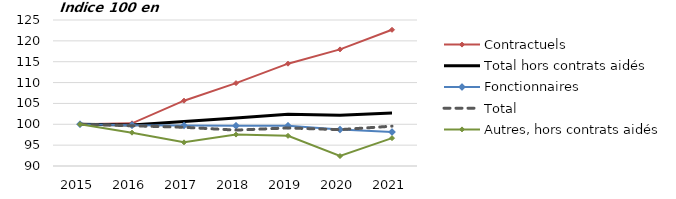
| Category | Contractuels | Total hors contrats aidés | Fonctionnaires | Total  | Autres, hors contrats aidés |
|---|---|---|---|---|---|
| 2015.0 | 100 | 100 | 100 | 100 | 100 |
| 2016.0 | 100.229 | 99.816 | 99.791 | 99.645 | 97.986 |
| 2017.0 | 105.657 | 100.684 | 99.69 | 99.283 | 95.675 |
| 2018.0 | 109.87 | 101.513 | 99.66 | 98.604 | 97.53 |
| 2019.0 | 114.53 | 102.379 | 99.657 | 99.122 | 97.232 |
| 2020.0 | 117.951 | 102.159 | 98.75 | 98.711 | 92.387 |
| 2021.0 | 122.653 | 102.711 | 98.145 | 99.55 | 96.682 |